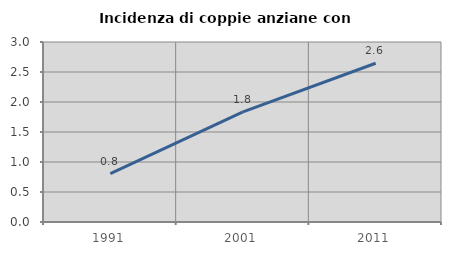
| Category | Incidenza di coppie anziane con figli |
|---|---|
| 1991.0 | 0.805 |
| 2001.0 | 1.836 |
| 2011.0 | 2.646 |